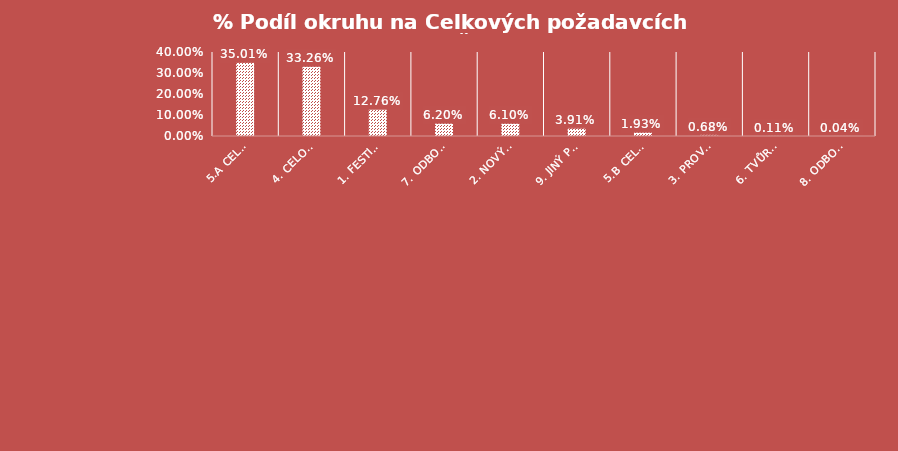
| Category | Series 0 |
|---|---|
| 5.a Celoroční produkční činnost (s prostorem) | 0.35 |
| 4. Celoroční inscenační činnost tvůrčího subjektu | 0.333 |
| 1. Festival, přehlídka | 0.128 |
| 7. Odborná periodická publikace | 0.062 |
| 2. Nový inscenační projekt | 0.061 |
| 9. Jiný projekt | 0.039 |
| 5.b Celoroční produkční činnost (bez prostoru) | 0.019 |
| 3. Provozování inscenačního projektu | 0.007 |
| 6. Tvůrčí dílna, odborný kurs, konference, seminář | 0.001 |
| 8. Odborná neperiodická publikace | 0 |